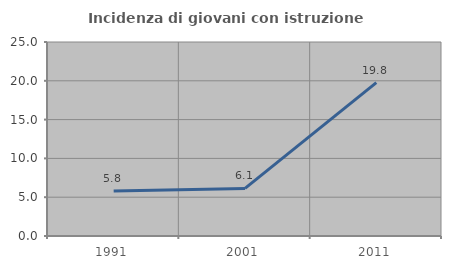
| Category | Incidenza di giovani con istruzione universitaria |
|---|---|
| 1991.0 | 5.814 |
| 2001.0 | 6.136 |
| 2011.0 | 19.764 |